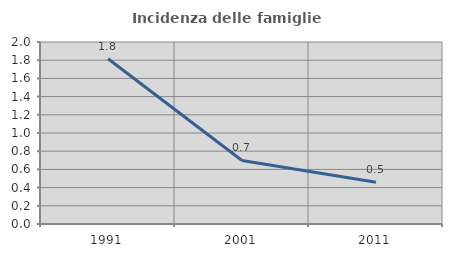
| Category | Incidenza delle famiglie numerose |
|---|---|
| 1991.0 | 1.816 |
| 2001.0 | 0.698 |
| 2011.0 | 0.459 |